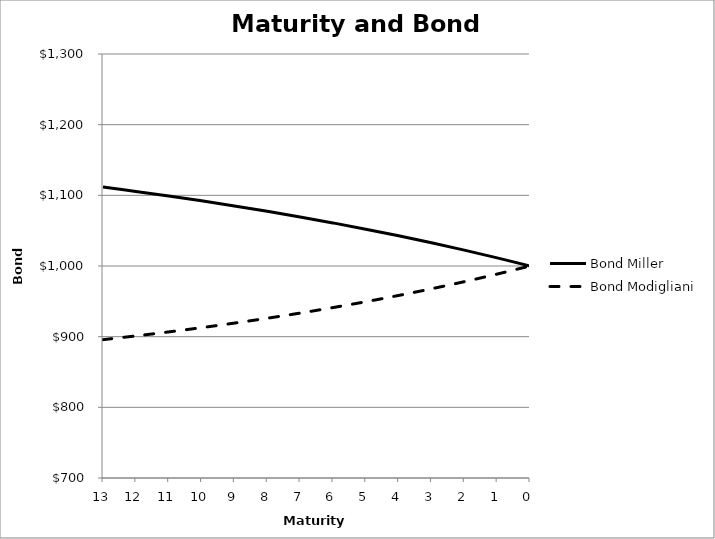
| Category | Bond Miller | Bond Modigliani |
|---|---|---|
| 13.0 | 1111.713 | 895.761 |
| 12.0 | 1105.553 | 901.07 |
| 11.0 | 1099.062 | 906.73 |
| 10.0 | 1092.223 | 912.764 |
| 9.0 | 1085.017 | 919.196 |
| 8.0 | 1077.423 | 926.054 |
| 7.0 | 1069.422 | 933.364 |
| 6.0 | 1060.991 | 941.158 |
| 5.0 | 1052.108 | 949.466 |
| 4.0 | 1042.747 | 958.323 |
| 3.0 | 1032.884 | 967.764 |
| 2.0 | 1022.491 | 977.83 |
| 1.0 | 1011.539 | 988.561 |
| 0.0 | 1000 | 1000 |